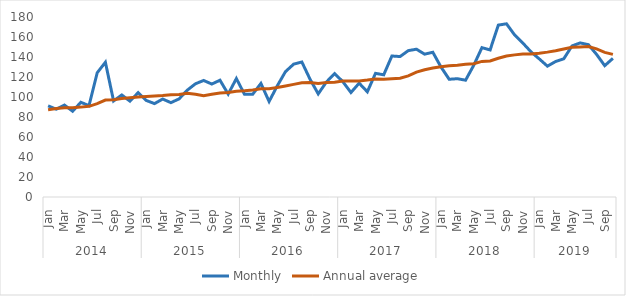
| Category | Monthly | Annual average |
|---|---|---|
| 0 | 91.172 | 87.258 |
| 1 | 87.795 | 88.6 |
| 2 | 91.925 | 89.367 |
| 3 | 85.793 | 89.314 |
| 4 | 94.702 | 89.879 |
| 5 | 91.375 | 90.649 |
| 6 | 124.243 | 93.285 |
| 7 | 134.751 | 96.991 |
| 8 | 96.05 | 97.232 |
| 9 | 102.032 | 98.524 |
| 10 | 95.842 | 99.319 |
| 11 | 104.32 | 100 |
| 12 | 96.525 | 100.446 |
| 13 | 93.393 | 100.913 |
| 14 | 97.959 | 101.415 |
| 15 | 94.356 | 102.129 |
| 16 | 98.093 | 102.412 |
| 17 | 106.814 | 103.698 |
| 18 | 113.212 | 102.779 |
| 19 | 116.54 | 101.261 |
| 20 | 112.953 | 102.67 |
| 21 | 116.784 | 103.899 |
| 22 | 102.901 | 104.488 |
| 23 | 118.434 | 105.664 |
| 24 | 102.639 | 106.173 |
| 25 | 102.81 | 106.958 |
| 26 | 113.562 | 108.258 |
| 27 | 95.519 | 108.355 |
| 28 | 111.187 | 109.446 |
| 29 | 125.368 | 110.992 |
| 30 | 132.853 | 112.629 |
| 31 | 135.013 | 114.169 |
| 32 | 117.791 | 114.572 |
| 33 | 103.136 | 113.434 |
| 34 | 114.985 | 114.441 |
| 35 | 123.408 | 114.856 |
| 36 | 115.412 | 115.92 |
| 37 | 104.485 | 116.06 |
| 38 | 113.825 | 116.082 |
| 39 | 105.211 | 116.89 |
| 40 | 123.659 | 117.929 |
| 41 | 122.192 | 117.664 |
| 42 | 140.996 | 118.343 |
| 43 | 140.454 | 118.796 |
| 44 | 146.37 | 121.178 |
| 45 | 147.791 | 124.899 |
| 46 | 142.845 | 127.221 |
| 47 | 144.734 | 128.998 |
| 48 | 129.971 | 130.211 |
| 49 | 117.721 | 131.314 |
| 50 | 118.31 | 131.688 |
| 51 | 116.791 | 132.653 |
| 52 | 131.732 | 133.326 |
| 53 | 149.357 | 135.589 |
| 54 | 147.046 | 136.094 |
| 55 | 171.905 | 138.714 |
| 56 | 173.192 | 140.95 |
| 57 | 161.986 | 142.132 |
| 58 | 153.917 | 143.055 |
| 59 | 145.117 | 143.087 |
| 60 | 138.119 | 143.766 |
| 61 | 130.858 | 144.861 |
| 62 | 135.482 | 146.292 |
| 63 | 138.236 | 148.079 |
| 64 | 151.054 | 149.689 |
| 65 | 154.087 | 150.083 |
| 66 | 152.354 | 150.526 |
| 67 | 142.661 | 148.089 |
| 68 | 131.329 | 144.6 |
| 69 | 138.625 | 142.653 |